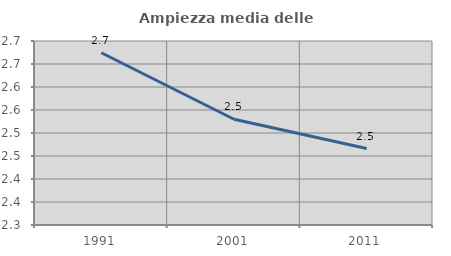
| Category | Ampiezza media delle famiglie |
|---|---|
| 1991.0 | 2.674 |
| 2001.0 | 2.53 |
| 2011.0 | 2.466 |